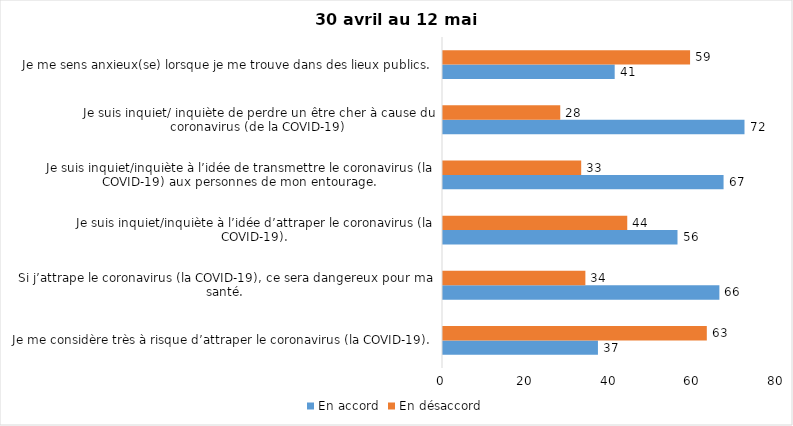
| Category | En accord | En désaccord |
|---|---|---|
| Je me considère très à risque d’attraper le coronavirus (la COVID-19). | 37 | 63 |
| Si j’attrape le coronavirus (la COVID-19), ce sera dangereux pour ma santé. | 66 | 34 |
| Je suis inquiet/inquiète à l’idée d’attraper le coronavirus (la COVID-19). | 56 | 44 |
| Je suis inquiet/inquiète à l’idée de transmettre le coronavirus (la COVID-19) aux personnes de mon entourage. | 67 | 33 |
| Je suis inquiet/ inquiète de perdre un être cher à cause du coronavirus (de la COVID-19) | 72 | 28 |
| Je me sens anxieux(se) lorsque je me trouve dans des lieux publics. | 41 | 59 |